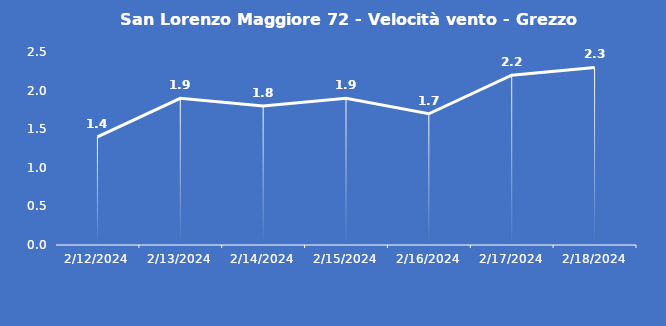
| Category | San Lorenzo Maggiore 72 - Velocità vento - Grezzo (m/s) |
|---|---|
| 2/12/24 | 1.4 |
| 2/13/24 | 1.9 |
| 2/14/24 | 1.8 |
| 2/15/24 | 1.9 |
| 2/16/24 | 1.7 |
| 2/17/24 | 2.2 |
| 2/18/24 | 2.3 |